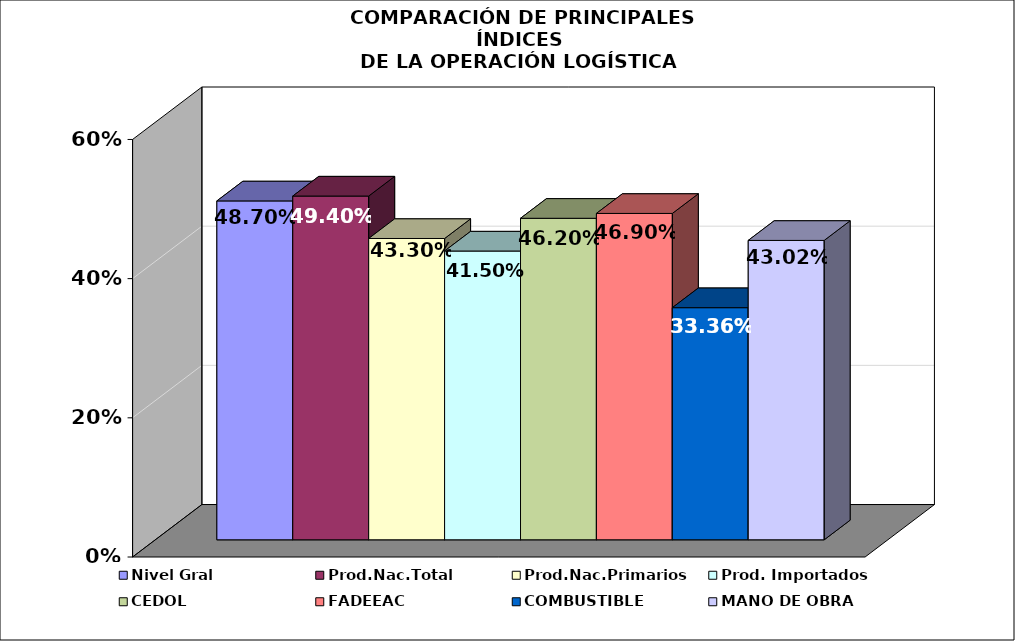
| Category | Nivel Gral | Prod.Nac.Total | Prod.Nac.Primarios | Prod. Importados | CEDOL | FADEEAC | COMBUSTIBLE | MANO DE OBRA |
|---|---|---|---|---|---|---|---|---|
| 0 | 0.487 | 0.494 | 0.433 | 0.415 | 0.462 | 0.469 | 0.334 | 0.43 |